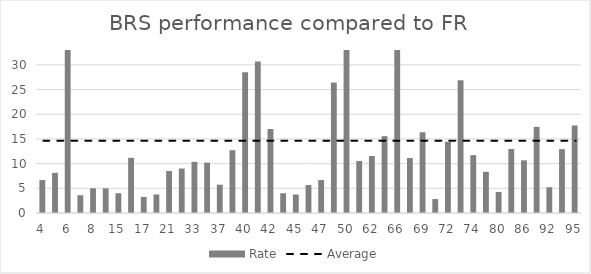
| Category | Rate |
|---|---|
| 4.0 | 6.667 |
| 5.0 | 8.125 |
| 6.0 | 62.25 |
| 7.0 | 3.6 |
| 8.0 | 5 |
| 10.0 | 5 |
| 15.0 | 4 |
| 16.0 | 11.167 |
| 17.0 | 3.25 |
| 18.0 | 3.75 |
| 21.0 | 8.5 |
| 22.0 | 9 |
| 33.0 | 10.35 |
| 34.0 | 10.2 |
| 37.0 | 5.728 |
| 38.0 | 12.719 |
| 40.0 | 28.479 |
| 41.0 | 30.657 |
| 42.0 | 17 |
| 44.0 | 4 |
| 45.0 | 3.75 |
| 46.0 | 5.667 |
| 47.0 | 6.667 |
| 48.0 | 26.398 |
| 50.0 | 42.684 |
| 57.0 | 10.533 |
| 62.0 | 11.538 |
| 63.0 | 15.556 |
| 66.0 | 84.911 |
| 67.0 | 11.128 |
| 69.0 | 16.35 |
| 70.0 | 2.827 |
| 72.0 | 14.415 |
| 73.0 | 26.869 |
| 74.0 | 11.714 |
| 76.0 | 8.333 |
| 80.0 | 4.265 |
| 83.0 | 12.953 |
| 86.0 | 10.667 |
| 89.0 | 17.446 |
| 92.0 | 5.224 |
| 93.0 | 12.933 |
| 95.0 | 17.711 |